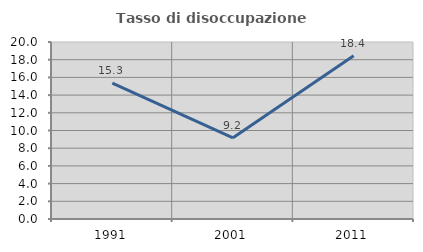
| Category | Tasso di disoccupazione giovanile  |
|---|---|
| 1991.0 | 15.342 |
| 2001.0 | 9.168 |
| 2011.0 | 18.444 |